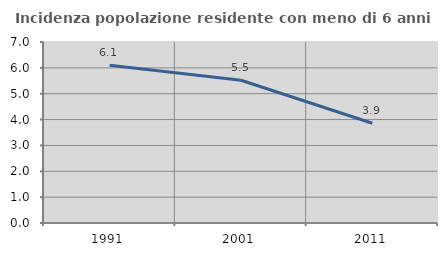
| Category | Incidenza popolazione residente con meno di 6 anni |
|---|---|
| 1991.0 | 6.1 |
| 2001.0 | 5.52 |
| 2011.0 | 3.858 |